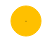
| Category | Series 0 |
|---|---|
| 0 | 100 |
| 1 | 0 |